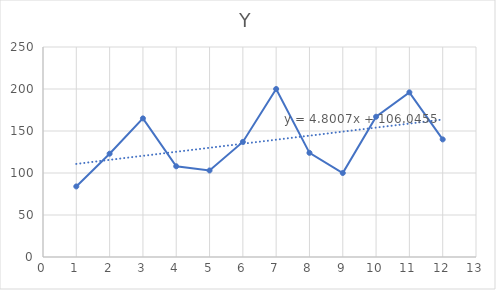
| Category | Y |
|---|---|
| 1.0 | 84 |
| 2.0 | 123 |
| 3.0 | 165 |
| 4.0 | 108 |
| 5.0 | 103 |
| 6.0 | 137 |
| 7.0 | 200 |
| 8.0 | 124 |
| 9.0 | 100 |
| 10.0 | 167 |
| 11.0 | 196 |
| 12.0 | 140 |